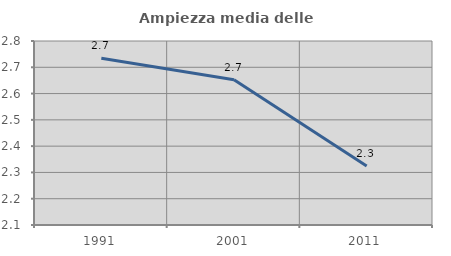
| Category | Ampiezza media delle famiglie |
|---|---|
| 1991.0 | 2.734 |
| 2001.0 | 2.653 |
| 2011.0 | 2.325 |